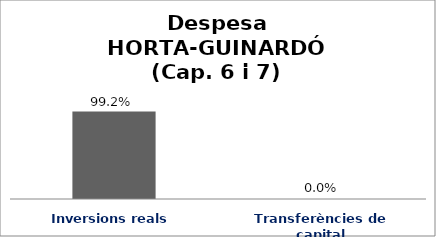
| Category | Series 0 |
|---|---|
| Inversions reals | 0.992 |
| Transferències de capital | 0 |